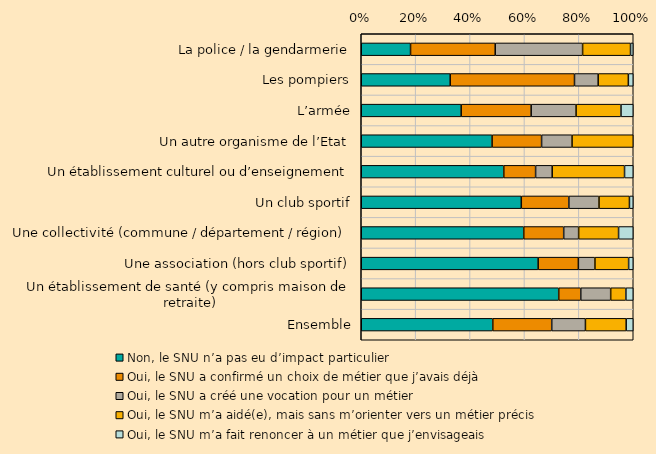
| Category | Non, le SNU n’a pas eu d’impact particulier | Oui, le SNU a confirmé un choix de métier que j’avais déjà | Oui, le SNU a créé une vocation pour un métier | Oui, le SNU m’a aidé(e), mais sans m’orienter vers un métier précis | Oui, le SNU m’a fait renoncer à un métier que j’envisageais |
|---|---|---|---|---|---|
| La police / la gendarmerie | 0.181 | 0.311 | 0.321 | 0.176 | 0.01 |
| Les pompiers | 0.327 | 0.457 | 0.087 | 0.111 | 0.018 |
| L’armée | 0.367 | 0.257 | 0.165 | 0.165 | 0.045 |
| Un autre organisme de l’Etat | 0.481 | 0.182 | 0.112 | 0.225 | 0 |
| Un établissement culturel ou d’enseignement | 0.524 | 0.117 | 0.061 | 0.266 | 0.032 |
| Un club sportif | 0.589 | 0.175 | 0.111 | 0.112 | 0.014 |
| Une collectivité (commune / département / région) | 0.598 | 0.147 | 0.055 | 0.147 | 0.054 |
| Une association (hors club sportif) | 0.651 | 0.148 | 0.061 | 0.124 | 0.017 |
| Un établissement de santé (y compris maison de retraite) | 0.726 | 0.081 | 0.11 | 0.056 | 0.027 |
| Ensemble | 0.484 | 0.217 | 0.124 | 0.15 | 0.026 |